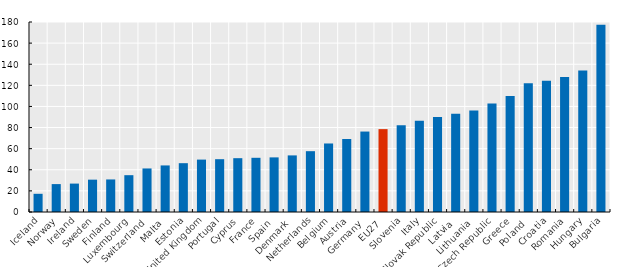
| Category | Series 0 |
|---|---|
| Iceland | 17.241 |
| Norway | 26.435 |
| Ireland | 26.915 |
| Sweden | 30.632 |
| Finland | 30.836 |
| Luxembourg | 34.884 |
| Switzerland | 41.254 |
| Malta | 44.118 |
| Estonia | 46.247 |
| United Kingdom | 49.642 |
| Portugal | 50.031 |
| Cyprus | 50.987 |
| France | 51.353 |
| Spain | 51.741 |
| Denmark | 53.624 |
| Netherlands | 57.622 |
| Belgium | 64.918 |
| Austria | 69.145 |
| Germany | 76.215 |
| EU27 | 78.51 |
| Slovenia | 82.245 |
| Italy | 86.469 |
| Slovak Republic | 90.024 |
| Latvia | 93.071 |
| Lithuania | 96.12 |
| Czech Republic | 102.733 |
| Greece | 109.859 |
| Poland | 121.916 |
| Croatia | 124.239 |
| Romania | 128.002 |
| Hungary | 133.974 |
| Bulgaria | 177.305 |